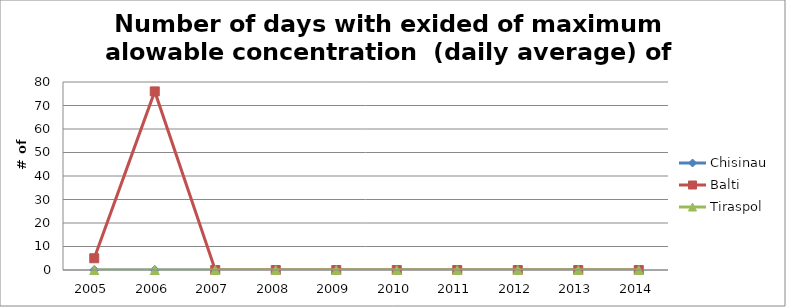
| Category | Chisinau | Balti | Tiraspol |
|---|---|---|---|
| 2005.0 | 0 | 5 | 0 |
| 2006.0 | 0 | 76 | 0 |
| 2007.0 | 0 | 0 | 0 |
| 2008.0 | 0 | 0 | 0 |
| 2009.0 | 0 | 0 | 0 |
| 2010.0 | 0 | 0 | 0 |
| 2011.0 | 0 | 0 | 0 |
| 2012.0 | 0 | 0 | 0 |
| 2013.0 | 0 | 0 | 0 |
| 2014.0 | 0 | 0 | 0 |